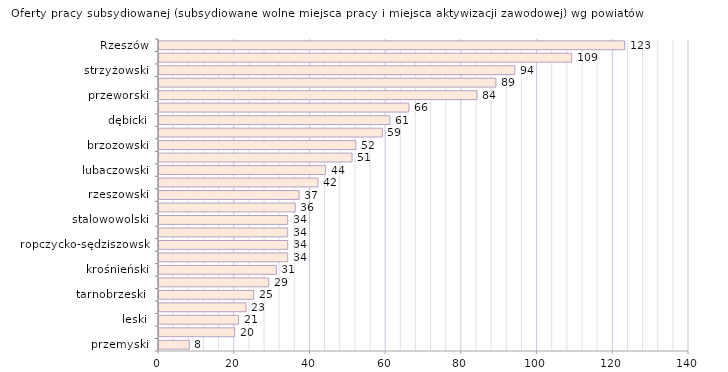
| Category | Oferty pracy subsydiowanej (subsydiowane wolne miejsca pracy i miejsca aktywizacji zawodowej) wg powiatów |
|---|---|
| przemyski | 8 |
| Tarnobrzeg | 20 |
| leski | 21 |
| bieszczadzki | 23 |
| tarnobrzeski  | 25 |
| Krosno | 29 |
| krośnieński | 31 |
| łańcucki | 34 |
| ropczycko-sędziszowski | 34 |
| sanocki | 34 |
| stalowowolski | 34 |
| Przemyśl | 36 |
| rzeszowski | 37 |
| leżajski | 42 |
| lubaczowski | 44 |
| niżański | 51 |
| brzozowski | 52 |
| kolbuszowski | 59 |
| dębicki | 61 |
| mielecki | 66 |
| przeworski | 84 |
| jarosławski | 89 |
| strzyżowski | 94 |
| jasielski | 109 |
| Rzeszów | 123 |